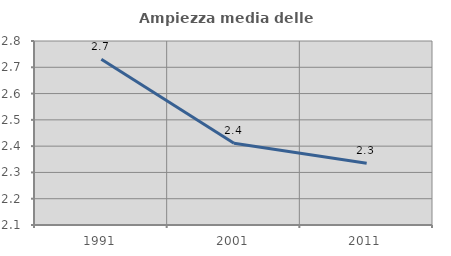
| Category | Ampiezza media delle famiglie |
|---|---|
| 1991.0 | 2.731 |
| 2001.0 | 2.411 |
| 2011.0 | 2.335 |